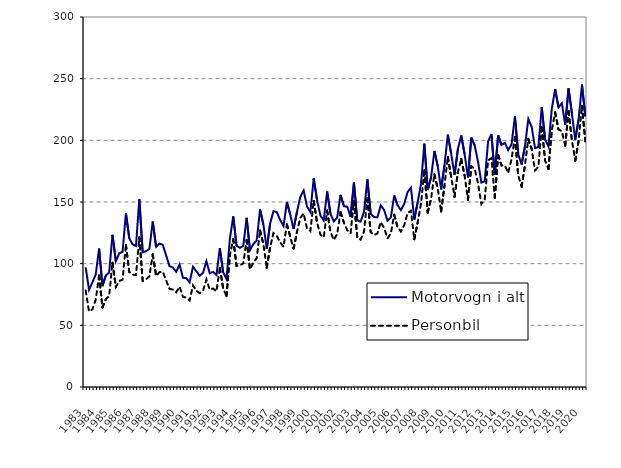
| Category | Motorvogn i alt | Personbil |
|---|---|---|
| 1983.0 | 97 | 78.3 |
| nan | 78.8 | 61.3 |
| nan | 84.8 | 63 |
| nan | 91.2 | 70.8 |
| 1984.0 | 112.2 | 90.4 |
| nan | 81.8 | 64.4 |
| nan | 90.4 | 71.1 |
| nan | 92.9 | 73.9 |
| 1985.0 | 123.4 | 100.8 |
| nan | 102 | 81.1 |
| nan | 108.4 | 86 |
| nan | 109.6 | 87.1 |
| 1986.0 | 141 | 115.2 |
| nan | 120.5 | 93.2 |
| nan | 115.7 | 91.1 |
| nan | 114.4 | 90.8 |
| 1987.0 | 152.2 | 121.3 |
| nan | 109.2 | 86.1 |
| nan | 110.1 | 87.3 |
| nan | 112 | 89.8 |
| 1988.0 | 134.1 | 107.5 |
| nan | 113.7 | 90 |
| nan | 116.3 | 93.1 |
| nan | 115.2 | 93.4 |
| 1989.0 | 106.6 | 86.4 |
| nan | 98 | 79.6 |
| nan | 96.9 | 79 |
| nan | 93.4 | 76.8 |
| 1990.0 | 99.4 | 81.3 |
| nan | 88.6 | 73.1 |
| nan | 88.2 | 72.5 |
| nan | 84.8 | 70.2 |
| 1991.0 | 97.5 | 82.4 |
| nan | 93.9 | 78 |
| nan | 90.2 | 76.1 |
| nan | 92.6 | 78.1 |
| 1992.0 | 102 | 87.1 |
| nan | 92.2 | 78.9 |
| nan | 93.3 | 79.9 |
| nan | 90.8 | 77.6 |
| 1993.0 | 112.6 | 96.5 |
| nan | 93 | 80.1 |
| nan | 87.5 | 73.6 |
| nan | 120.1 | 106.6 |
| 1994.0 | 138.4 | 120 |
| nan | 114.5 | 98.1 |
| nan | 112.8 | 98.8 |
| nan | 114.5 | 100.2 |
| 1995.0 | 137.2 | 119.3 |
| nan | 111 | 95.4 |
| nan | 115.9 | 101 |
| nan | 118.8 | 104.4 |
| 1996.0 | 143.9 | 126.9 |
| nan | 131.6 | 115.7 |
| nan | 112 | 96.7 |
| nan | 132.5 | 113.1 |
| 1997.0 | 142.6 | 124.8 |
| nan | 141.8 | 122.5 |
| nan | 135.4 | 117.3 |
| nan | 130.6 | 113.7 |
| 1998.0 | 150 | 131.9 |
| nan | 139.8 | 122 |
| nan | 128.1 | 112.1 |
| nan | 141.8 | 125.6 |
| 1999.0 | 154.2 | 137.1 |
| nan | 159.3 | 140.7 |
| nan | 146.3 | 128.7 |
| nan | 141.9 | 126.4 |
| 2000.0 | 169.1 | 150.9 |
| nan | 151.5 | 133.4 |
| nan | 139 | 123.5 |
| nan | 135.1 | 121.4 |
| 2001.0 | 158.5 | 143.1 |
| nan | 140.46 | 125.7 |
| nan | 134.24 | 119.2 |
| nan | 137.495 | 124.072 |
| 2002.0 | 155.814 | 141.724 |
| nan | 146.543 | 133.19 |
| nan | 146.231 | 127.141 |
| nan | 137.967 | 124.641 |
| 2003.0 | 165.679 | 150.811 |
| nan | 135.021 | 121.101 |
| nan | 134.111 | 119.491 |
| nan | 142.013 | 125.959 |
| 2004.0 | 168.309 | 153.043 |
| nan | 140.267 | 125.568 |
| nan | 137.77 | 123.121 |
| nan | 137.685 | 124.506 |
| 2005.0 | 147.311 | 133.756 |
| nan | 143.517 | 128.79 |
| nan | 134.783 | 120.571 |
| nan | 137.37 | 124.382 |
| 2006.0 | 155.213 | 139.728 |
| nan | 147.444 | 129.572 |
| nan | 143.451 | 126.006 |
| nan | 148.561 | 131.195 |
| 2007.0 | 158.1 | 141.084 |
| nan | 161.613 | 142.897 |
| nan | 135.821 | 119.753 |
| nan | 149.791 | 133.498 |
| 2008.0 | 164.642 | 148.614 |
| nan | 197.287 | 175.714 |
| nan | 159.718 | 141.407 |
| nan | 170.057 | 152.54 |
| 2009.0 | 191.38 | 172.559 |
| nan | 178.906 | 160.765 |
| nan | 160.234 | 142.312 |
| nan | 179.857 | 163.532 |
| 2010.0 | 204.636 | 186.507 |
| nan | 188.957 | 170.463 |
| nan | 172.077 | 154.156 |
| nan | 192.961 | 174.399 |
| 2011.0 | 204.005 | 184.86 |
| nan | 188.741 | 171.333 |
| nan | 169.934 | 151.694 |
| nan | 202.176 | 178.919 |
| 2012.0 | 195.829 | 177.072 |
| nan | 182.751 | 165.128 |
| nan | 165.73 | 148.242 |
| nan | 166.805 | 151.728 |
| 2013.0 | 199.181 | 183.653 |
| nan | 205.015 | 185.634 |
| nan | 172.044 | 153.21 |
| nan | 204.1 | 188.079 |
| 2014.0 | 196.177 | 179.552 |
| nan | 197.965 | 179.767 |
| nan | 192.105 | 173.474 |
| nan | 196.809 | 184.739 |
| 2015.0 | 219.419 | 202.592 |
| nan | 188.696 | 171.451 |
| nan | 180.388 | 162.297 |
| nan | 195.23 | 179.891 |
| 2016.0 | 217.298 | 201.197 |
| nan | 210.949 | 192.893 |
| nan | 193.648 | 175.642 |
| nan | 194.663 | 178.455 |
| 2017.0 | 227.029 | 210.738 |
| nan | 200.767 | 183.708 |
| nan | 195.059 | 176.766 |
| nan | 225.423 | 208.218 |
| 2018.0 | 241.528 | 222.678 |
| nan | 226.771 | 208.839 |
| nan | 230.044 | 207.395 |
| nan | 212.667 | 195.666 |
| 2019.0 | 242.056 | 223.584 |
| nan | 221.711 | 199.972 |
| nan | 200.668 | 183.518 |
| nan | 216.92 | 199.72 |
| 2020.0 | 245.163 | 227.947 |
| nan | 219.434 | 199.239 |